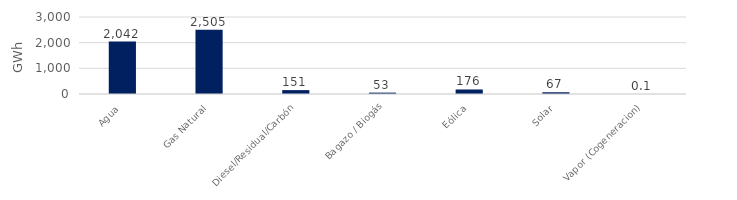
| Category | Series 0 |
|---|---|
| Agua | 2042.113 |
| Gas Natural | 2504.759 |
| Diesel/Residual/Carbón | 151.125 |
| Bagazo / Biogás | 53.271 |
| Eólica | 175.873 |
| Solar | 67.429 |
| Vapor (Cogeneracion) | 0.108 |